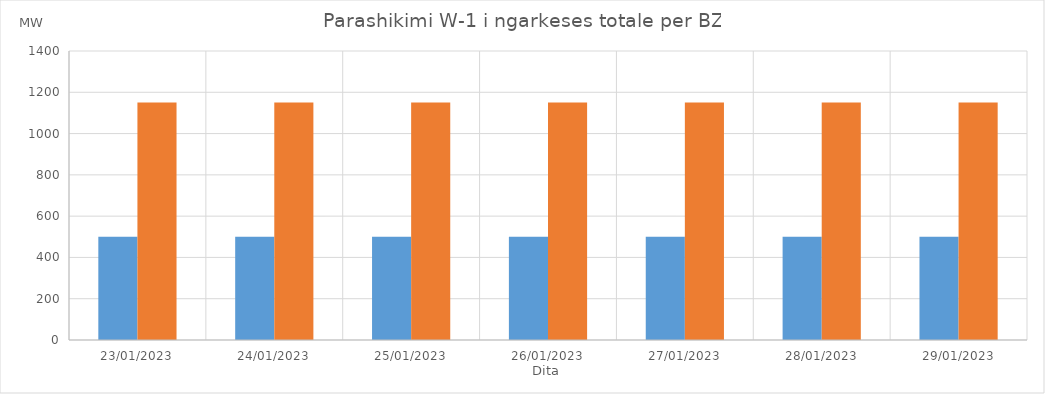
| Category | Min (MW) | Max (MW) |
|---|---|---|
| 23/01/2023 | 500 | 1150 |
| 24/01/2023 | 500 | 1150 |
| 25/01/2023 | 500 | 1150 |
| 26/01/2023 | 500 | 1150 |
| 27/01/2023 | 500 | 1150 |
| 28/01/2023 | 500 | 1150 |
| 29/01/2023 | 500 | 1150 |